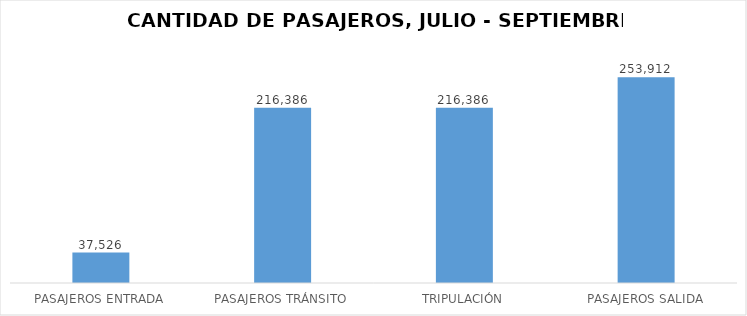
| Category | Series 0 |
|---|---|
| PASAJEROS ENTRADA | 37526 |
| PASAJEROS TRÁNSITO | 216386 |
| TRIPULACIÓN | 216386 |
| PASAJEROS SALIDA | 253912 |